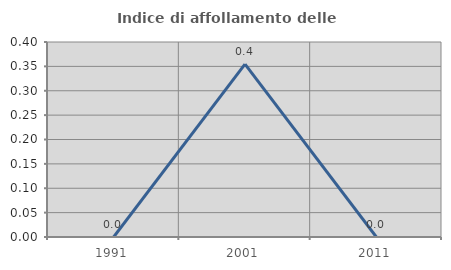
| Category | Indice di affollamento delle abitazioni  |
|---|---|
| 1991.0 | 0 |
| 2001.0 | 0.355 |
| 2011.0 | 0 |